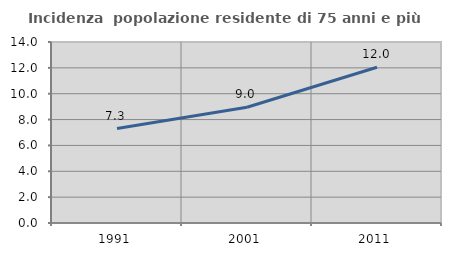
| Category | Incidenza  popolazione residente di 75 anni e più |
|---|---|
| 1991.0 | 7.303 |
| 2001.0 | 8.954 |
| 2011.0 | 12.044 |